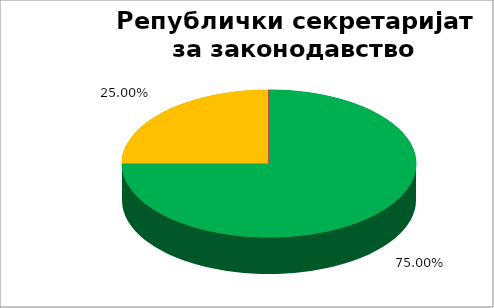
| Category | Републички секретаријат за законодавство |
|---|---|
| 0 | 0.75 |
| 1 | 0.25 |
| 2 | 0 |
| 3 | 0 |
| 4 | 0 |